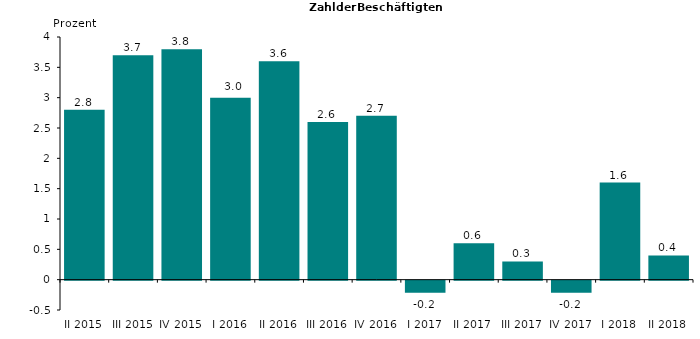
| Category | 2,8 3,7 3,8 3,0 3,6 2,6 2,7 -0,2 0,6 0,3 -0,2 1,6 0,4 |
|---|---|
| II 2015 | 2.8 |
| III 2015 | 3.7 |
| IV 2015 | 3.8 |
| I 2016 | 3 |
| II 2016 | 3.6 |
| III 2016 | 2.6 |
| IV 2016 | 2.7 |
| I 2017 | -0.2 |
| II 2017 | 0.6 |
| III 2017 | 0.3 |
| IV 2017 | -0.2 |
| I 2018 | 1.6 |
| II 2018 | 0.4 |